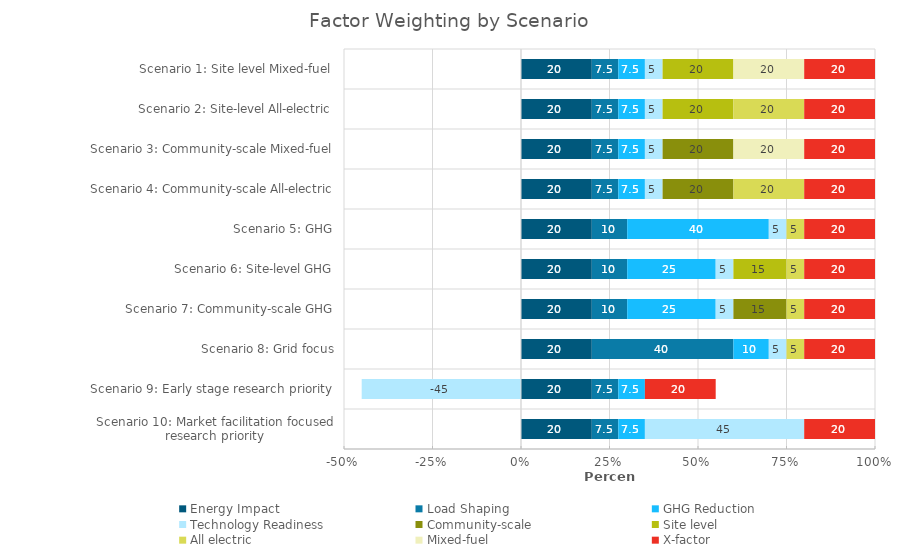
| Category | Energy Impact | Load Shaping | GHG Reduction | Technology Readiness | Community-scale | Site level | All electric | Mixed-fuel | X-factor |
|---|---|---|---|---|---|---|---|---|---|
| Scenario 1: Site level Mixed-fuel | 20 | 7.5 | 7.5 | 5 | 0 | 20 | 0 | 20 | 20 |
| Scenario 2: Site-level All-electric | 20 | 7.5 | 7.5 | 5 | 0 | 20 | 20 | 0 | 20 |
| Scenario 3: Community-scale Mixed-fuel | 20 | 7.5 | 7.5 | 5 | 20 | 0 | 0 | 20 | 20 |
| Scenario 4: Community-scale All-electric | 20 | 7.5 | 7.5 | 5 | 20 | 0 | 20 | 0 | 20 |
| Scenario 5: GHG | 20 | 10 | 40 | 5 | 0 | 0 | 5 | 0 | 20 |
| Scenario 6: Site-level GHG | 20 | 10 | 25 | 5 | 0 | 15 | 5 | 0 | 20 |
| Scenario 7: Community-scale GHG | 20 | 10 | 25 | 5 | 15 | 0 | 5 | 0 | 20 |
| Scenario 8: Grid focus | 20 | 40 | 10 | 5 | 0 | 0 | 5 | 0 | 20 |
| Scenario 9: Early stage research priority | 20 | 7.5 | 7.5 | -45 | 0 | 0 | 0 | 0 | 20 |
| Scenario 10: Market facilitation focused research priority | 20 | 7.5 | 7.5 | 45 | 0 | 0 | 0 | 0 | 20 |